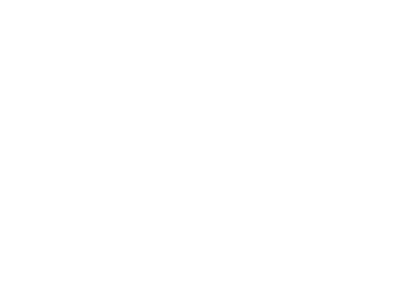
| Category | Total |
|---|---|
| A iniciar | 8 |
| Cancelado | 1 |
| Em dia | 10 |
| - | 3 |